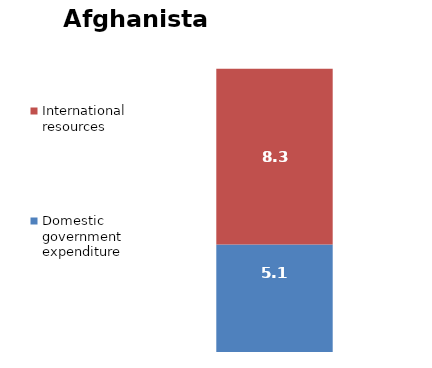
| Category | Domestic government expenditure | International resources |
|---|---|---|
| 0 | 5.079 | 8.289 |